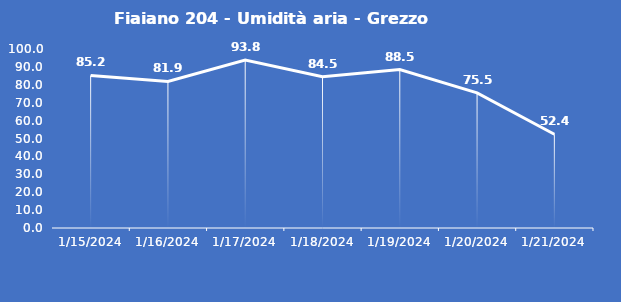
| Category | Fiaiano 204 - Umidità aria - Grezzo (%) |
|---|---|
| 1/15/24 | 85.2 |
| 1/16/24 | 81.9 |
| 1/17/24 | 93.8 |
| 1/18/24 | 84.5 |
| 1/19/24 | 88.5 |
| 1/20/24 | 75.5 |
| 1/21/24 | 52.4 |